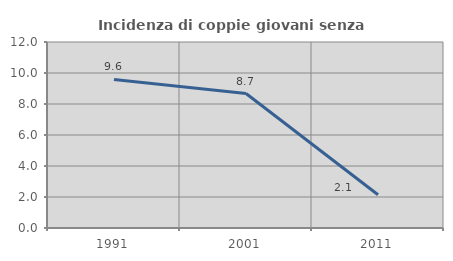
| Category | Incidenza di coppie giovani senza figli |
|---|---|
| 1991.0 | 9.581 |
| 2001.0 | 8.673 |
| 2011.0 | 2.146 |